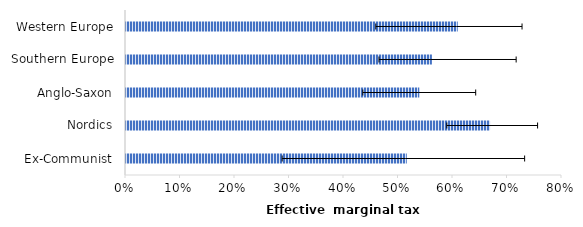
| Category | 2019 |
|---|---|
| Ex-Communist | 0.515 |
| Nordics | 0.668 |
| Anglo-Saxon | 0.538 |
| Southern Europe | 0.561 |
| Western Europe | 0.609 |